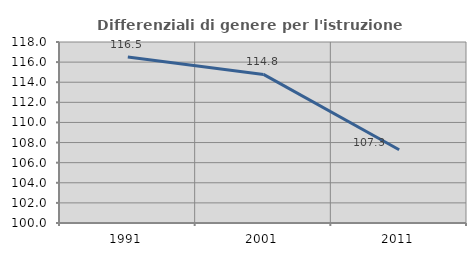
| Category | Differenziali di genere per l'istruzione superiore |
|---|---|
| 1991.0 | 116.498 |
| 2001.0 | 114.775 |
| 2011.0 | 107.288 |